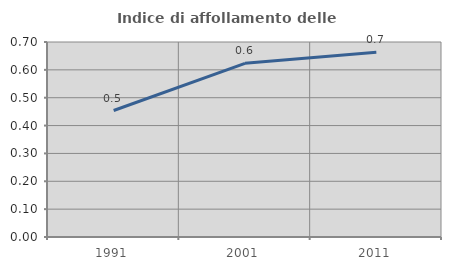
| Category | Indice di affollamento delle abitazioni  |
|---|---|
| 1991.0 | 0.454 |
| 2001.0 | 0.623 |
| 2011.0 | 0.663 |